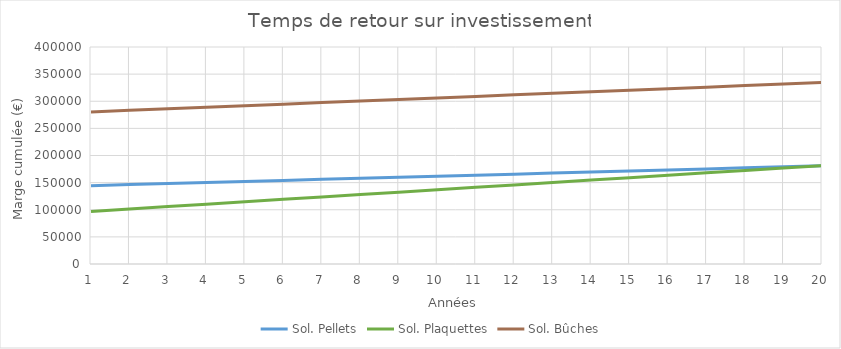
| Category | Sol. Pellets | Sol. Plaquettes | Sol. Bûches |
|---|---|---|---|
| 1.0 | 144428.4 | 96942 | 280354.5 |
| 2.0 | 146356.8 | 101384 | 283209 |
| 3.0 | 148285.2 | 105826 | 286063.5 |
| 4.0 | 150213.6 | 110268 | 288918 |
| 5.0 | 152142 | 114710 | 291772.5 |
| 6.0 | 154070.4 | 119152 | 294627 |
| 7.0 | 155998.8 | 123594 | 297481.5 |
| 8.0 | 157927.2 | 128036 | 300336 |
| 9.0 | 159855.6 | 132478 | 303190.5 |
| 10.0 | 161784 | 136920 | 306045 |
| 11.0 | 163712.4 | 141362 | 308899.5 |
| 12.0 | 165640.8 | 145804 | 311754 |
| 13.0 | 167569.2 | 150246 | 314608.5 |
| 14.0 | 169497.6 | 154688 | 317463 |
| 15.0 | 171426 | 159130 | 320317.5 |
| 16.0 | 173354.4 | 163572 | 323172 |
| 17.0 | 175282.8 | 168014 | 326026.5 |
| 18.0 | 177211.2 | 172456 | 328881 |
| 19.0 | 179139.6 | 176898 | 331735.5 |
| 20.0 | 181068 | 181340 | 334590 |